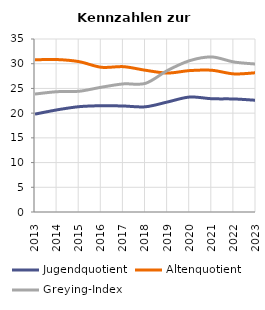
| Category | Jugendquotient | Altenquotient | Greying-Index |
|---|---|---|---|
| 2013.0 | 19.801 | 30.793 | 23.866 |
| 2014.0 | 20.666 | 30.844 | 24.341 |
| 2015.0 | 21.312 | 30.413 | 24.431 |
| 2016.0 | 21.497 | 29.281 | 25.24 |
| 2017.0 | 21.444 | 29.403 | 25.917 |
| 2018.0 | 21.287 | 28.676 | 26.029 |
| 2019.0 | 22.262 | 28.115 | 28.642 |
| 2020.0 | 23.26 | 28.61 | 30.62 |
| 2021.0 | 22.911 | 28.676 | 31.365 |
| 2022.0 | 22.87 | 27.94 | 30.35 |
| 2023.0 | 22.599 | 28.178 | 29.929 |